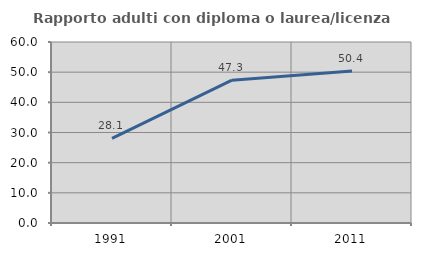
| Category | Rapporto adulti con diploma o laurea/licenza media  |
|---|---|
| 1991.0 | 28.082 |
| 2001.0 | 47.343 |
| 2011.0 | 50.403 |